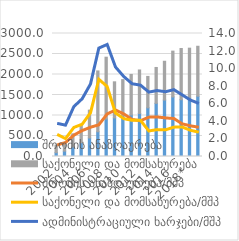
| Category | შრომის ანაზღაურება | საქონელი და მომსახურება |
|---|---|---|
| 2002 | 93.9 | 183.1 |
| 2003 | 131.5 | 169.3 |
| 2004 | 233 | 319.2 |
| 2005 | 336.7 | 420.2 |
| 2006 | 451.5 | 678.5 |
| 2007 | 603.5 | 1483.8 |
| 2008 | 913.1 | 1508.7 |
| 2009 | 941.6 | 879.9 |
| 2010 | 993.4 | 881.5 |
| 2011 | 1012.474 | 989.005 |
| 2012 | 1049.425 | 1060.947 |
| 2013 | 1187.569 | 765.801 |
| 2014 | 1296.186 | 875.411 |
| 2015 | 1376.776 | 946.218 |
| 2016 | 1452.292 | 1117.79 |
| 2017 | 1385.37 | 1248.448 |
| 2018* | 1425.619 | 1216.512 |
| 2019** | 1470.663 | 1218.152 |